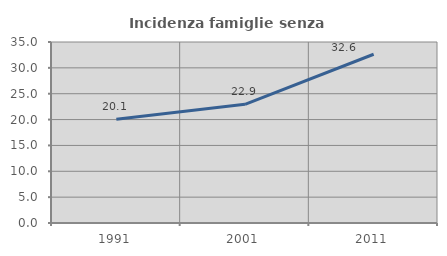
| Category | Incidenza famiglie senza nuclei |
|---|---|
| 1991.0 | 20.074 |
| 2001.0 | 22.95 |
| 2011.0 | 32.633 |